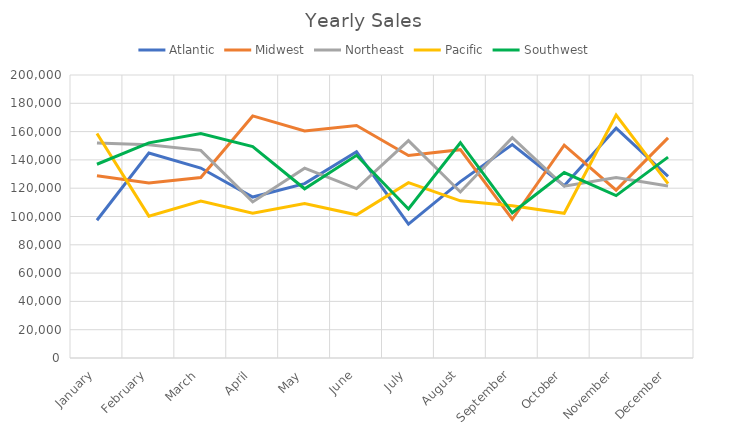
| Category | Atlantic | Midwest | Northeast | Pacific | Southwest |
|---|---|---|---|---|---|
| January | 97358 | 128857 | 151996 | 158640 | 136930 |
| February | 144896 | 123734 | 150652 | 100239 | 152064 |
| March | 134259 | 127505 | 146773 | 110963 | 158706 |
| April | 113734 | 171078 | 110323 | 102349 | 149418 |
| May | 123251 | 160431 | 134144 | 109174 | 119590 |
| June | 145744 | 164329 | 119754 | 101209 | 143231 |
| July | 94674 | 143155 | 153589 | 123949 | 105335 |
| August | 124685 | 147216 | 117340 | 111051 | 152151 |
| September | 150853 | 98056 | 155676 | 107609 | 102631 |
| October | 121743 | 150420 | 121367 | 102283 | 131023 |
| November | 162364 | 118644 | 127504 | 171697 | 114747 |
| December | 128398 | 155534 | 121481 | 123228 | 141966 |